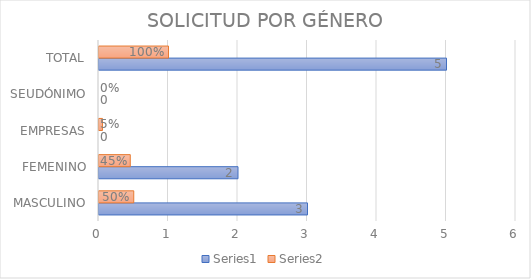
| Category | Series 0 | Series 1 |
|---|---|---|
| MASCULINO | 3 | 0.5 |
| FEMENINO | 2 | 0.45 |
| EMPRESAS | 0 | 0.05 |
| SEUDÓNIMO | 0 | 0 |
| TOTAL | 5 | 1 |